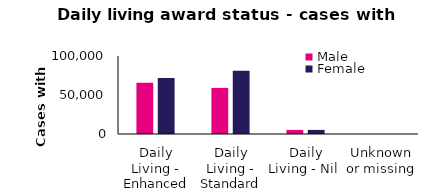
| Category | Male | Female |
|---|---|---|
| Daily Living - Enhanced | 65691 | 71805 |
| Daily Living - Standard | 59142 | 81003 |
| Daily Living - Nil  | 5225 | 5252 |
| Unknown or missing | 6 | 8 |